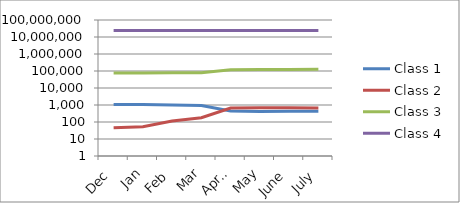
| Category | Class 1 | Class 2 | Class 3 | Class 4 |
|---|---|---|---|---|
| Dec | 1078 | 46 | 75711 | 23957573 |
| Jan | 1067 | 53 | 76685 | 23972323 |
| Feb | 990 | 115 | 78345 | 23986004 |
| Mar | 930 | 179 | 80084 | 23996449 |
| April | 449 | 663 | 119857 | 23975239 |
| May | 420 | 686 | 121241 | 23988139 |
| June | 422 | 687 | 123483 | 24005430 |
| July | 427 | 658 | 125491 | 24038014 |